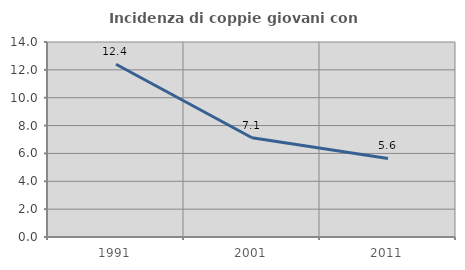
| Category | Incidenza di coppie giovani con figli |
|---|---|
| 1991.0 | 12.404 |
| 2001.0 | 7.124 |
| 2011.0 | 5.64 |